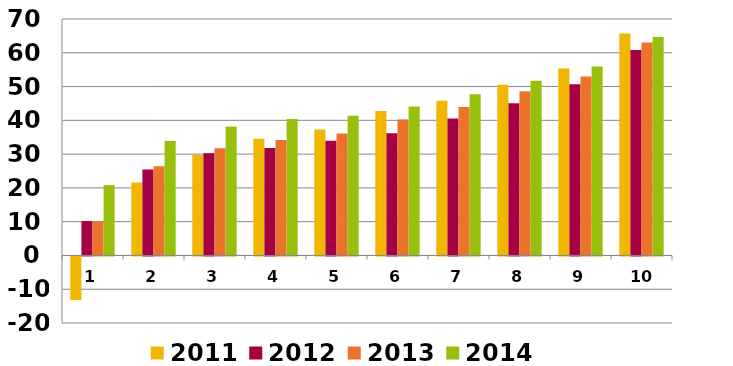
| Category | 2011 | 2012 | 2013 | 2014 |
|---|---|---|---|---|
| 1.0 | -12.916 | 10.17 | 10.191 | 20.817 |
| 2.0 | 21.608 | 25.479 | 26.424 | 33.879 |
| 3.0 | 29.782 | 30.234 | 31.767 | 38.197 |
| 4.0 | 34.578 | 31.783 | 34.18 | 40.406 |
| 5.0 | 37.266 | 33.955 | 36.092 | 41.374 |
| 6.0 | 42.74 | 36.203 | 40.248 | 44.128 |
| 7.0 | 45.803 | 40.512 | 43.918 | 47.699 |
| 8.0 | 50.55 | 45.094 | 48.62 | 51.709 |
| 9.0 | 55.359 | 50.652 | 52.965 | 55.91 |
| 10.0 | 65.715 | 60.832 | 63.069 | 64.682 |